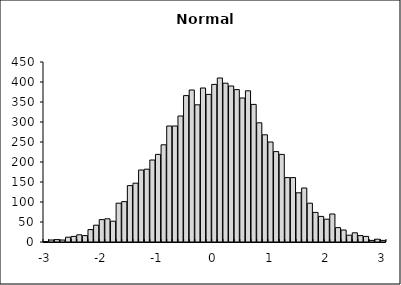
| Category | Series 0 |
|---|---|
| -3.0 | 1 |
| -2.9 | 5 |
| -2.8 | 6 |
| -2.7 | 5 |
| -2.6 | 12 |
| -2.5 | 14 |
| -2.4 | 18 |
| -2.3 | 16 |
| -2.2 | 31 |
| -2.1 | 42 |
| -2.0 | 56 |
| -1.9 | 58 |
| -1.8 | 52 |
| -1.7 | 97 |
| -1.6 | 101 |
| -1.5 | 141 |
| -1.4 | 147 |
| -1.3 | 180 |
| -1.2 | 182 |
| -1.1 | 205 |
| -1.0 | 219 |
| -0.9 | 243 |
| -0.8 | 290 |
| -0.7 | 290 |
| -0.6 | 315 |
| -0.5 | 366 |
| -0.4 | 380 |
| -0.3 | 343 |
| -0.2 | 385 |
| -0.1 | 369 |
| 0.0 | 394 |
| 0.1 | 410 |
| 0.2 | 397 |
| 0.3 | 390 |
| 0.4 | 381 |
| 0.5 | 360 |
| 0.6 | 378 |
| 0.7 | 344 |
| 0.8 | 298 |
| 0.9 | 268 |
| 1.0 | 250 |
| 1.1 | 226 |
| 1.2 | 219 |
| 1.3 | 161 |
| 1.4 | 161 |
| 1.5 | 123 |
| 1.6 | 135 |
| 1.7 | 97 |
| 1.8 | 74 |
| 1.9 | 64 |
| 2.0 | 57 |
| 2.1 | 70 |
| 2.2 | 36 |
| 2.3 | 30 |
| 2.40000000000001 | 17 |
| 2.5 | 23 |
| 2.6 | 16 |
| 2.70000000000001 | 14 |
| 2.80000000000001 | 4 |
| 2.90000000000001 | 7 |
| 3.0 | 4 |